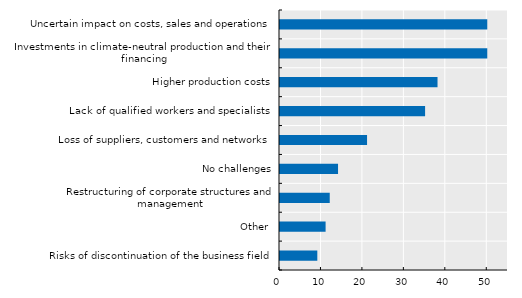
| Category | values |
|---|---|
| Risks of discontinuation of the business field | 9 |
| Other  | 11 |
| Restructuring of corporate structures and management | 12 |
| No challenges | 14 |
| Loss of suppliers, customers and networks | 21 |
| Lack of qualified workers and specialists | 35 |
| Higher production costs | 38 |
| Investments in climate-neutral production and their financing | 50 |
| Uncertain impact on costs, sales and operations | 50 |